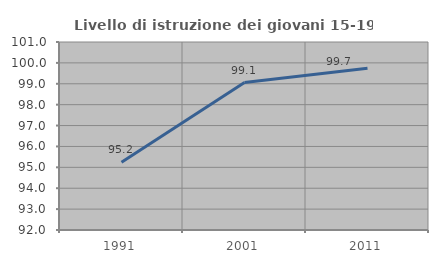
| Category | Livello di istruzione dei giovani 15-19 anni |
|---|---|
| 1991.0 | 95.246 |
| 2001.0 | 99.057 |
| 2011.0 | 99.739 |